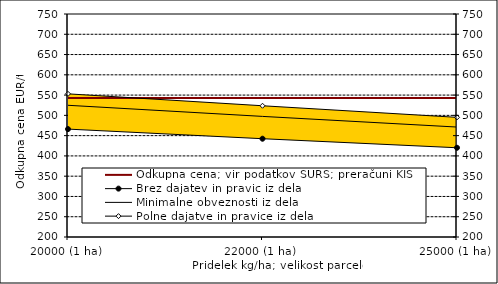
| Category | Odkupna cena; vir podatkov SURS; preračuni KIS |
|---|---|
| 20000 (1 ha) | 543 |
| 22000 (1 ha) | 543 |
| 25000 (1 ha) | 543 |